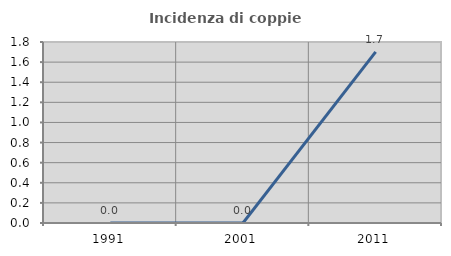
| Category | Incidenza di coppie miste |
|---|---|
| 1991.0 | 0 |
| 2001.0 | 0 |
| 2011.0 | 1.702 |